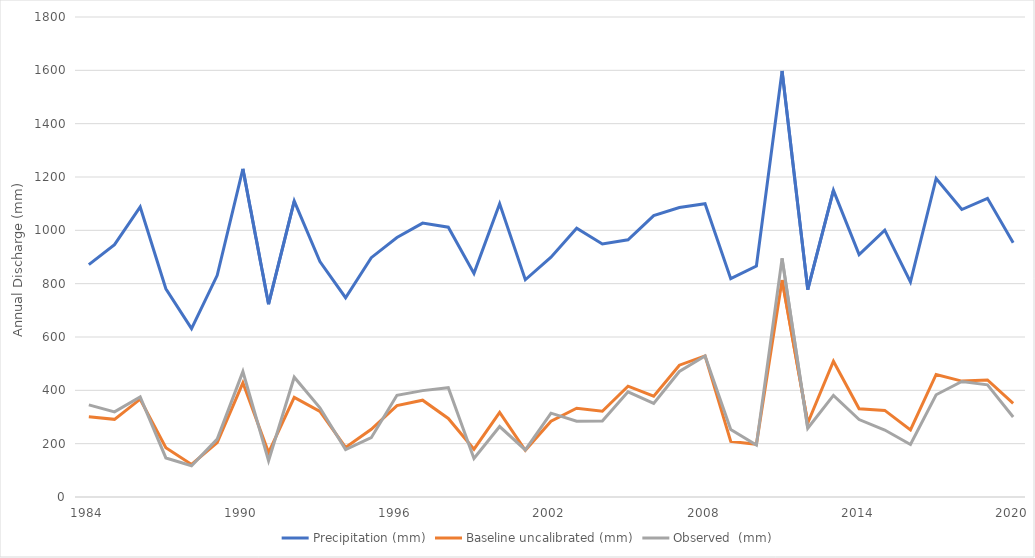
| Category | Precipitation (mm) | Baseline uncalibrated (mm) | Observed  (mm) |
|---|---|---|---|
| 1984 | 871.33 | 301.065 | 345.419 |
| 1985 | 946.12 | 291.171 | 319.304 |
| 1986 | 1087.47 | 366.833 | 375.057 |
| 1987 | 780.94 | 184.806 | 146.592 |
| 1988 | 631.51 | 122.218 | 117.394 |
| 1989 | 831.21 | 203.803 | 216.945 |
| 1990 | 1230.4 | 428.208 | 470.215 |
| 1991 | 723.02 | 166.453 | 135.867 |
| 1992 | 1109.85 | 373.745 | 449.28 |
| 1993 | 882.95 | 321.109 | 334.471 |
| 1994 | 747.25 | 186.065 | 177.783 |
| 1995 | 897.43 | 253.823 | 222.464 |
| 1996 | 972.94 | 342.932 | 381.59 |
| 1997 | 1027.04 | 363.069 | 398.897 |
| 1998 | 1011.93 | 294.448 | 409.991 |
| 1999 | 838.61 | 179.277 | 144.56 |
| 2000 | 1099.49 | 317.064 | 264.218 |
| 2001 | 814.66 | 175.093 | 176.473 |
| 2002 | 899.35 | 284.02 | 314.49 |
| 2003 | 1008.19 | 332.819 | 284.427 |
| 2004 | 948.9 | 321.692 | 285.198 |
| 2005 | 964.71 | 415.493 | 394.348 |
| 2006 | 1055.13 | 378.021 | 351.294 |
| 2007 | 1085.57 | 494.326 | 470.832 |
| 2008 | 1099.57 | 529.033 | 528.776 |
| 2009 | 818.6 | 208.615 | 253.374 |
| 2010 | 866.03 | 197.565 | 194.536 |
| 2011 | 1597.37 | 814.107 | 894.778 |
| 2012 | 777.7 | 277.572 | 257.649 |
| 2013 | 1149.86 | 509.138 | 380.843 |
| 2014 | 908.87 | 331.014 | 290.316 |
| 2015 | 1000.56 | 324.748 | 251.247 |
| 2016 | 806.77 | 251.394 | 196.87 |
| 2017 | 1194.45 | 459.65 | 383.3 |
| 2018 | 1078 | 434.631 | 433.205 |
| 2019 | 1119.98 | 438.69 | 420.553 |
| 2020 | 953.1 | 350.7 | 300.055 |